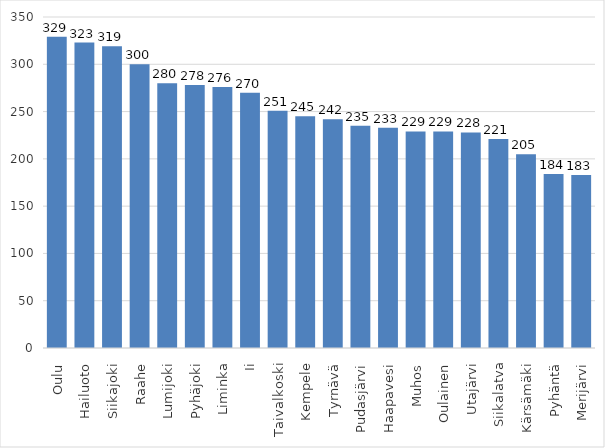
| Category | Series 0 |
|---|---|
| Oulu | 329 |
| Hailuoto | 323 |
| Siikajoki | 319 |
| Raahe | 300 |
| Lumijoki | 280 |
| Pyhäjoki | 278 |
| Liminka | 276 |
| Ii | 270 |
| Taivalkoski | 251 |
| Kempele | 245 |
| Tyrnävä | 242 |
| Pudasjärvi | 235 |
| Haapavesi | 233 |
| Muhos | 229 |
| Oulainen | 229 |
| Utajärvi | 228 |
| Siikalatva | 221 |
| Kärsämäki | 205 |
| Pyhäntä | 184 |
| Merijärvi | 183 |